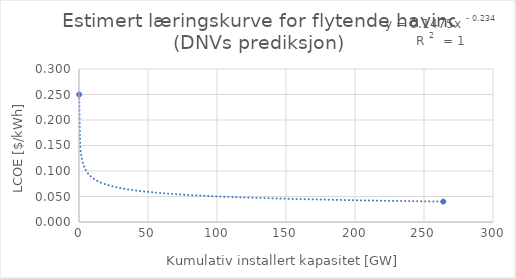
| Category | y |
|---|---|
| 0.105 | 0.25 |
| 264.0 | 0.04 |